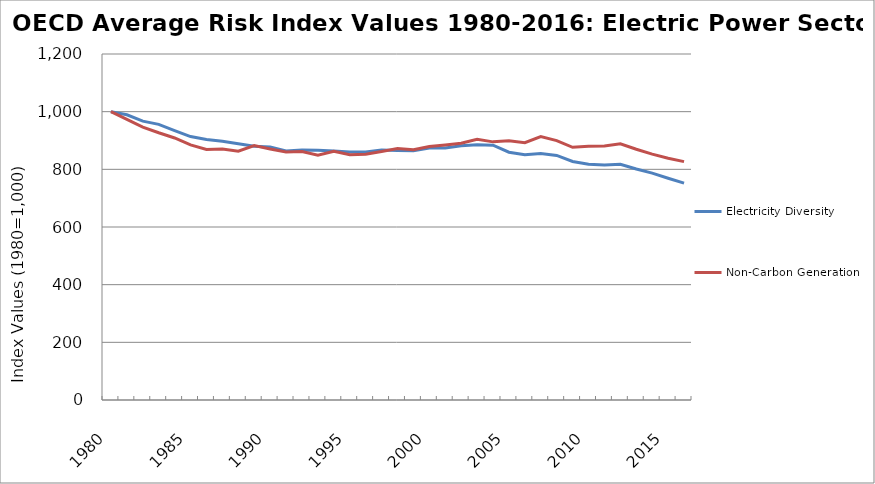
| Category | Electricity Diversity | Non-Carbon Generation |
|---|---|---|
| 1980.0 | 1000 | 1000 |
| 1981.0 | 989.189 | 973.074 |
| 1982.0 | 967.092 | 946.455 |
| 1983.0 | 956.078 | 926.827 |
| 1984.0 | 934.503 | 908.792 |
| 1985.0 | 913.563 | 884.839 |
| 1986.0 | 903.136 | 869.063 |
| 1987.0 | 897.515 | 870.815 |
| 1988.0 | 888.939 | 862.834 |
| 1989.0 | 879.992 | 882.467 |
| 1990.0 | 877.372 | 870.305 |
| 1991.0 | 863.953 | 860.39 |
| 1992.0 | 866.747 | 861.613 |
| 1993.0 | 866.553 | 849.217 |
| 1994.0 | 863.849 | 862.685 |
| 1995.0 | 860.354 | 850.986 |
| 1996.0 | 860.227 | 852.672 |
| 1997.0 | 867.317 | 861.629 |
| 1998.0 | 865.208 | 872.331 |
| 1999.0 | 864.436 | 867.958 |
| 2000.0 | 874.276 | 878.933 |
| 2001.0 | 873.985 | 884.568 |
| 2002.0 | 881.598 | 890.29 |
| 2003.0 | 885.27 | 904.165 |
| 2004.0 | 883.765 | 895.276 |
| 2005.0 | 859.392 | 898.986 |
| 2006.0 | 850.331 | 892.38 |
| 2007.0 | 855.252 | 913.777 |
| 2008.0 | 848.129 | 899.574 |
| 2009.0 | 827.4 | 876.252 |
| 2010.0 | 817.735 | 880.172 |
| 2011.0 | 815.013 | 880.717 |
| 2012.0 | 817.635 | 888.75 |
| 2013.0 | 800.947 | 869.647 |
| 2014.0 | 786.699 | 852.853 |
| 2015.0 | 769.253 | 838.718 |
| 2016.0 | 752.282 | 826.837 |